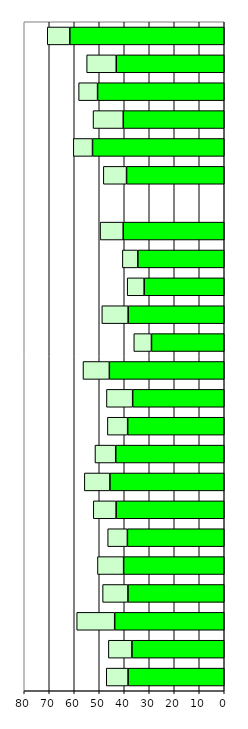
| Category | Series 0 | Series 1 |
|---|---|---|
| 0 | 38.481 | 8.715 |
| 1 | 36.931 | 9.414 |
| 2 | 43.827 | 15.195 |
| 3 | 38.519 | 10.143 |
| 4 | 40.239 | 10.476 |
| 5 | 38.742 | 7.889 |
| 6 | 43.261 | 9.114 |
| 7 | 45.736 | 10.227 |
| 8 | 43.412 | 8.299 |
| 9 | 38.636 | 8.103 |
| 10 | 36.637 | 10.478 |
| 11 | 45.959 | 10.544 |
| 12 | 29.107 | 7.073 |
| 13 | 38.447 | 10.521 |
| 14 | 32.043 | 6.782 |
| 15 | 34.564 | 6.185 |
| 16 | 40.417 | 9.25 |
| 17 | 0 | 0 |
| 18 | 39.076 | 9.292 |
| 19 | 52.69 | 7.681 |
| 20 | 40.39 | 12.09 |
| 21 | 50.663 | 7.586 |
| 22 | 43.202 | 11.832 |
| 23 | 61.771 | 9.032 |